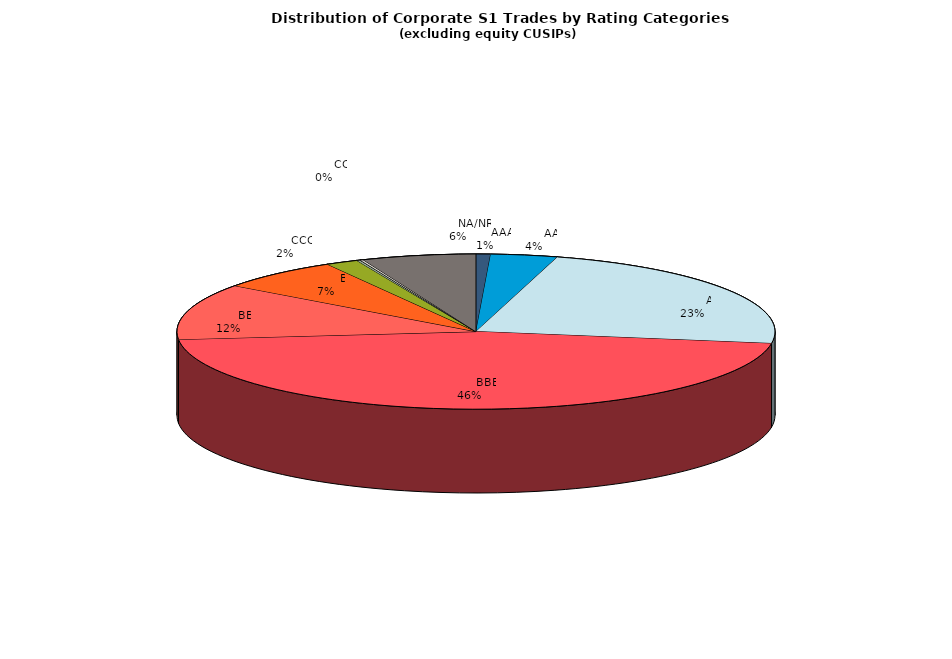
| Category | Series 0 |
|---|---|
|         AAA | 723.813 |
|         AA | 3327.327 |
|         A | 21247.052 |
|         BBB | 42334.606 |
|         BB | 10767.498 |
|         B | 6122.327 |
|         CCC | 1612.243 |
|         CC | 169.713 |
|         C | 12.873 |
|         D | 156.271 |
|         NA/NR | 5675.809 |